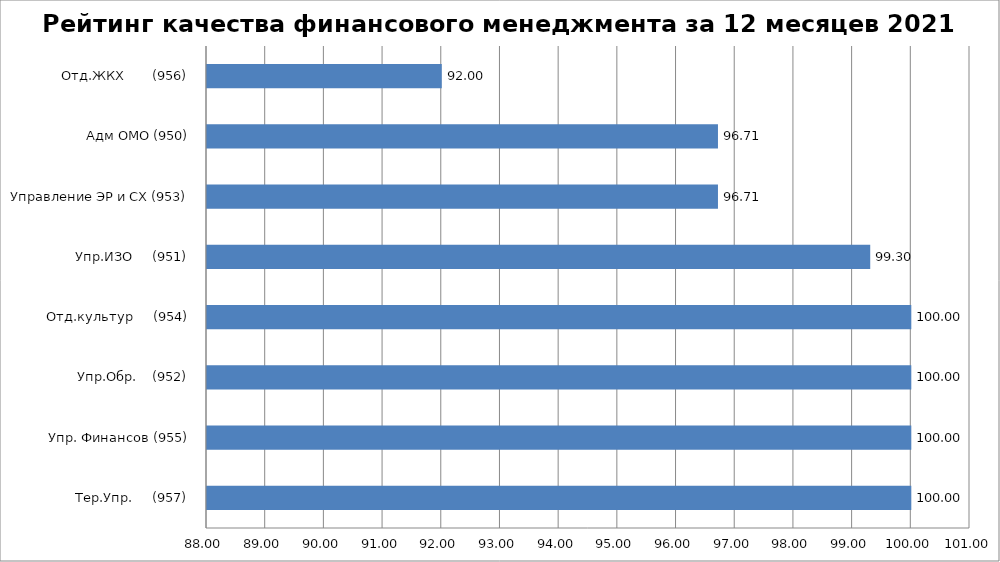
| Category | Series 0 |
|---|---|
| Тер.Упр.     (957) | 100 |
| Упр. Финансов (955) | 100 |
| Упр.Обр.    (952) | 100 |
| Отд.культур     (954) | 100 |
| Упр.ИЗО     (951) | 99.3 |
| Управление ЭР и СХ (953) | 96.706 |
| Адм ОМО (950) | 96.706 |
| Отд.ЖКХ       (956) | 92 |